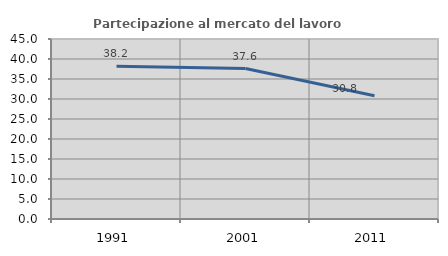
| Category | Partecipazione al mercato del lavoro  femminile |
|---|---|
| 1991.0 | 38.217 |
| 2001.0 | 37.611 |
| 2011.0 | 30.791 |